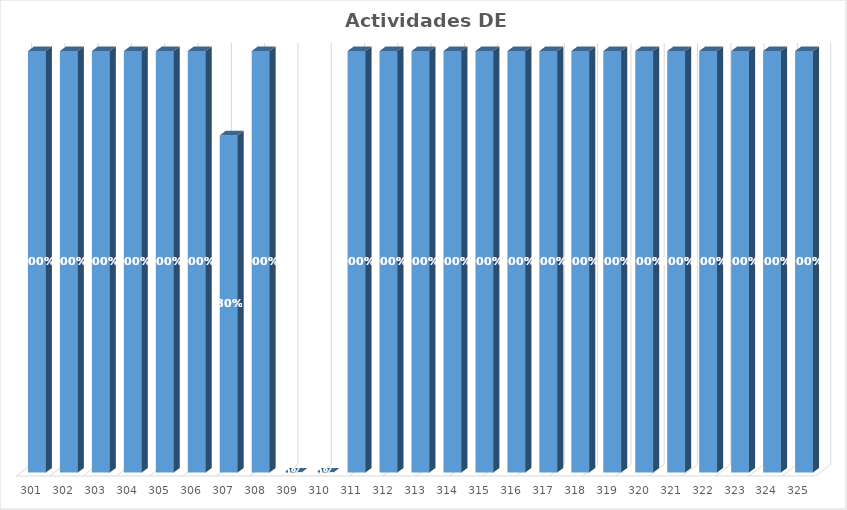
| Category | % Avance |
|---|---|
| 301.0 | 1 |
| 302.0 | 1 |
| 303.0 | 1 |
| 304.0 | 1 |
| 305.0 | 1 |
| 306.0 | 1 |
| 307.0 | 0.8 |
| 308.0 | 1 |
| 309.0 | 0 |
| 310.0 | 0 |
| 311.0 | 1 |
| 312.0 | 1 |
| 313.0 | 1 |
| 314.0 | 1 |
| 315.0 | 1 |
| 316.0 | 1 |
| 317.0 | 1 |
| 318.0 | 1 |
| 319.0 | 1 |
| 320.0 | 1 |
| 321.0 | 1 |
| 322.0 | 1 |
| 323.0 | 1 |
| 324.0 | 1 |
| 325.0 | 1 |